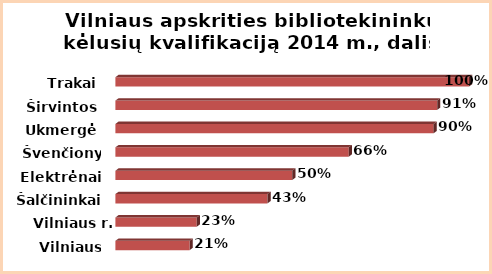
| Category | Series 0 |
|---|---|
| Vilniaus m. | 0.21 |
| Vilniaus r. | 0.23 |
| Šalčininkai | 0.43 |
| Elektrėnai | 0.5 |
| Švenčionys | 0.66 |
| Ukmergė | 0.9 |
| Širvintos | 0.91 |
| Trakai | 1 |